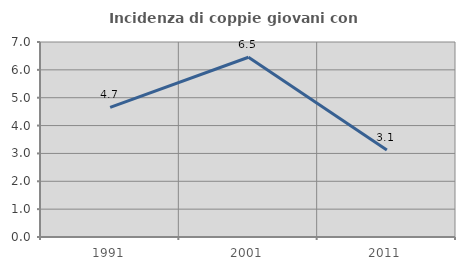
| Category | Incidenza di coppie giovani con figli |
|---|---|
| 1991.0 | 4.651 |
| 2001.0 | 6.452 |
| 2011.0 | 3.125 |